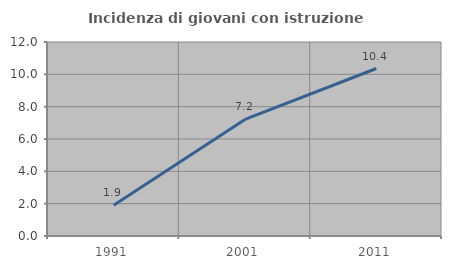
| Category | Incidenza di giovani con istruzione universitaria |
|---|---|
| 1991.0 | 1.896 |
| 2001.0 | 7.21 |
| 2011.0 | 10.36 |